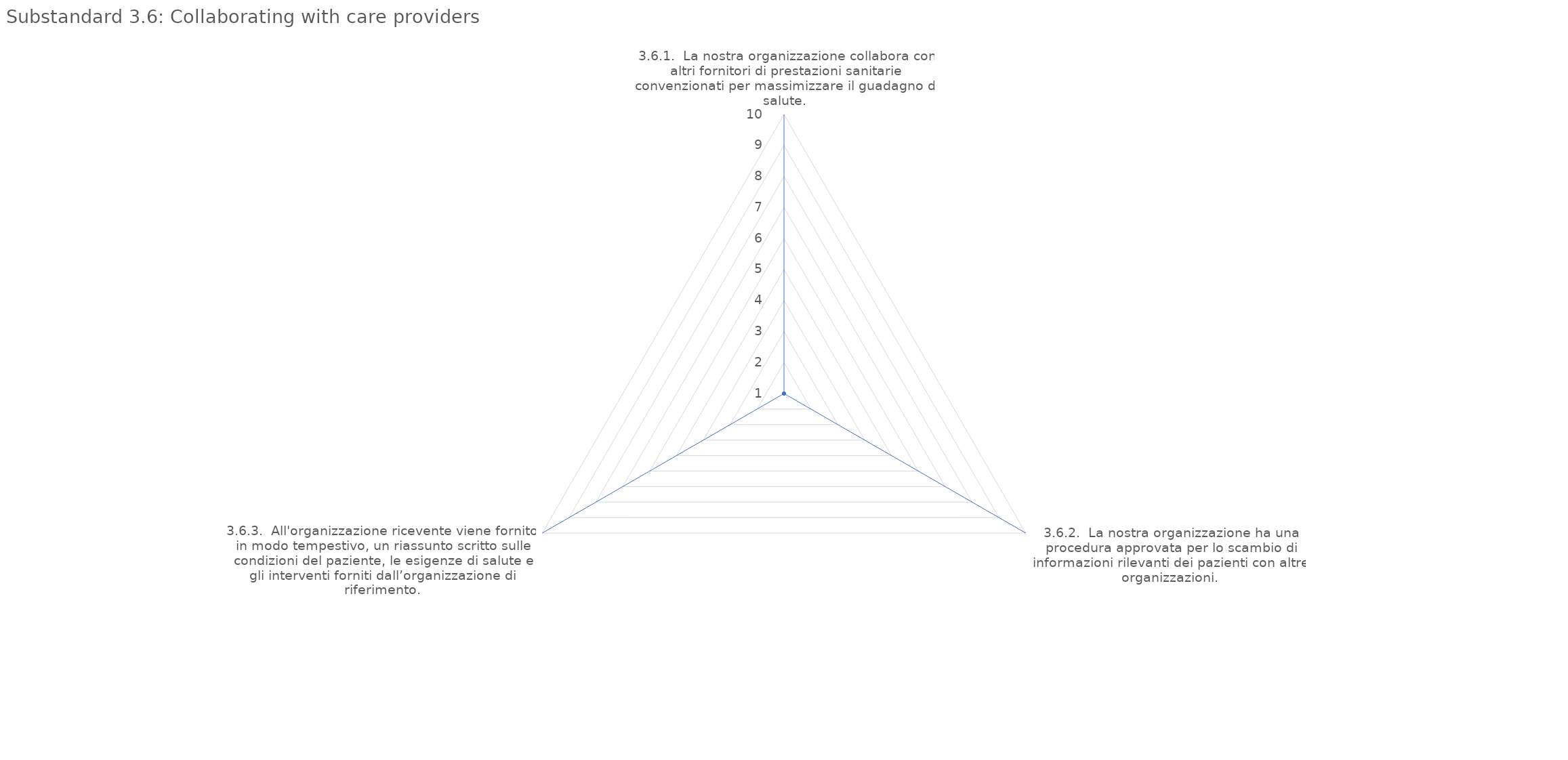
| Category | value |
|---|---|
| 3.6.1.  La nostra organizzazione collabora con altri fornitori di prestazioni sanitarie convenzionati per massimizzare il guadagno di salute. | 1 |
| 3.6.2.  La nostra organizzazione ha una procedura approvata per lo scambio di informazioni rilevanti dei pazienti con altre organizzazioni. | 1 |
| 3.6.3.  All'organizzazione ricevente viene fornito, in modo tempestivo, un riassunto scritto sulle condizioni del paziente, le esigenze di salute e gli interventi forniti dall’organizzazione di riferimento. | 1 |